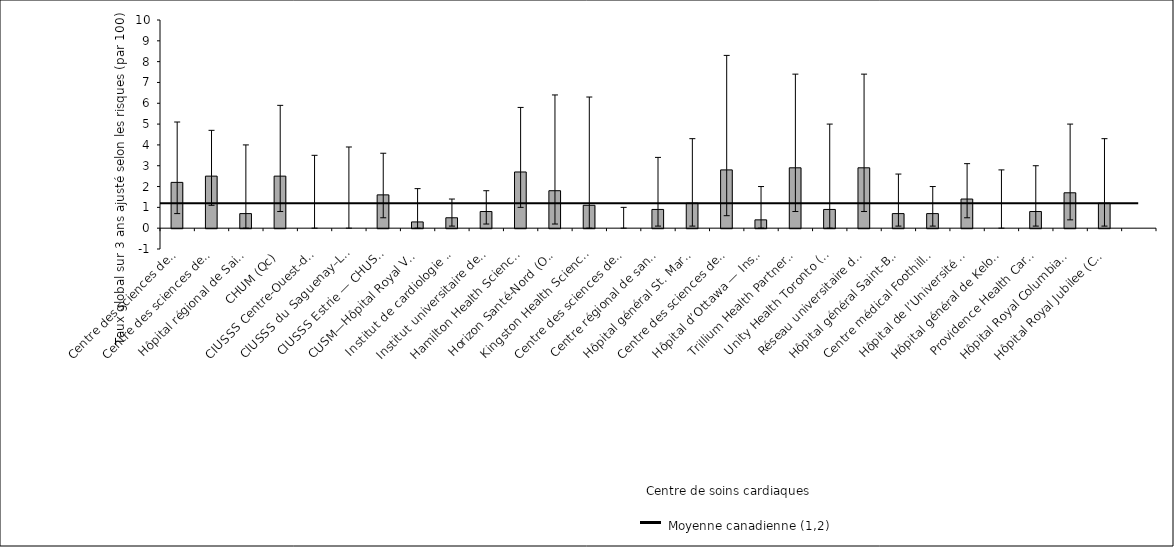
| Category | Taux ajusté selon les risques |
|---|---|
| Centre des sciences de la santé — St. John’s (T. -N.-L.) | 2.2 |
| Centre des sciences de la santé Queen Elizabeth II (N.-É.) | 2.5 |
| Hôpital régional de Saint John (N.-B.) | 0.7 |
| CHUM (Qc) | 2.5 |
| CIUSSS Centre-Ouest-de-l’Île-de-Mtl—Hôpital général juif (Qc) | 0 |
| CIUSSS du Saguenay–Lac-St-Jean—Hôpital de Chicoutimi (Qc) | 0 |
| CIUSSS Estrie — CHUS—Hôpital Fleurimont (Qc) | 1.6 |
| CUSM—Hôpital Royal Victoria (Qc) | 0.3 |
| Institut de cardiologie de Montréal (Qc) | 0.5 |
| Institut universitaire de cardiologie et pneumologie de Québec (Qc) | 0.8 |
| Hamilton Health Sciences (Ont.) | 2.7 |
| Horizon Santé-Nord (Ont.) | 1.8 |
| Kingston Health Sciences Centre (Ont.) | 1.1 |
| Centre des sciences de la santé de London* (Ont.) | 0 |
| Centre régional de santé Southlake (Ont.) | 0.9 |
| Hôpital général St. Mary’s (Ont.) | 1.2 |
| Centre des sciences de la santé Sunnybrook (Ont.) | 2.8 |
| Hôpital d’Ottawa — Institut de cardiologie de l’Université d’Ottawa (Ont.) | 0.4 |
| Trillium Health Partners (Ont.) | 2.9 |
| Unity Health Toronto (Ont.) | 0.9 |
| Réseau universitaire de santé (Ont.) | 2.9 |
| Hôpital général Saint-Boniface (Man.) | 0.7 |
| Centre médical Foothills (Alb.) | 0.7 |
| Hôpital de l’Université de l’Alberta (Alb.) | 1.4 |
| Hôpital général de Kelowna (C.-B.) | 0 |
| Providence Health Care — Hôpital St. Paul’s (Vancouver) (C.-B.) | 0.8 |
| Hôpital Royal Columbian (C.-B.) | 1.7 |
| Hôpital Royal Jubilee (C.-B.) | 1.2 |